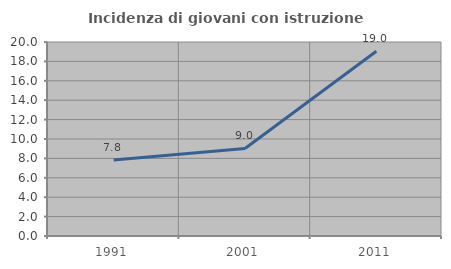
| Category | Incidenza di giovani con istruzione universitaria |
|---|---|
| 1991.0 | 7.831 |
| 2001.0 | 9.028 |
| 2011.0 | 19.048 |